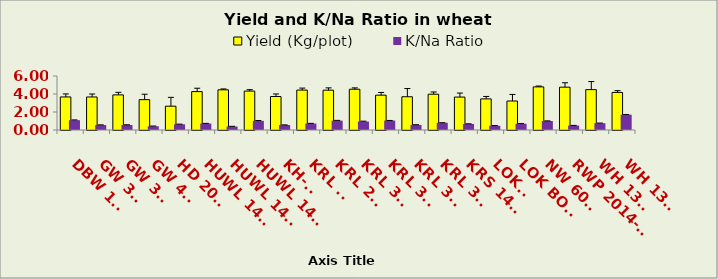
| Category | Yield (Kg/plot) | K/Na Ratio |
|---|---|---|
| DBW 181 | 3.673 | 1.091 |
| GW 322 | 3.669 | 0.55 |
| GW 366 | 3.902 | 0.556 |
| GW 496 | 3.372 | 0.416 |
| HD 2009 | 2.647 | 0.632 |
| HUWL 1412 | 4.266 | 0.723 |
| HUWL 1413 | 4.464 | 0.389 |
| HUWL 1427 | 4.326 | 1.015 |
| KH-65 | 3.72 | 0.554 |
| KRL 19 | 4.434 | 0.713 |
| KRL 210 | 4.424 | 1.039 |
| KRL 345 | 4.53 | 0.94 |
| KRL 346 | 3.873 | 1.05 |
| KRL 347 | 3.694 | 0.562 |
| KRL 351 | 3.976 | 0.803 |
| KRS 1416 | 3.66 | 0.671 |
| LOK 1 | 3.456 | 0.47 |
| LOK BOLD | 3.221 | 0.696 |
| NW 6096 | 4.79 | 0.997 |
| RWP 2014-20 | 4.759 | 0.493 |
| WH 1309 | 4.486 | 0.753 |
| WH 1311 | 4.176 | 1.702 |